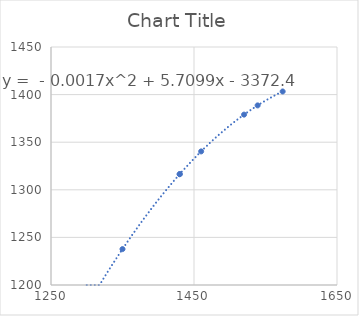
| Category | Series 0 |
|---|---|
| 1574.0 | 1403.273 |
| 1430.0 | 1316.427 |
| 1350.0 | 1237.715 |
| 1539.0 | 1388.65 |
| 1300.0 | 1177.47 |
| 1520.0 | 1378.968 |
| 1430.0 | 1316.427 |
| 1460.0 | 1340.334 |